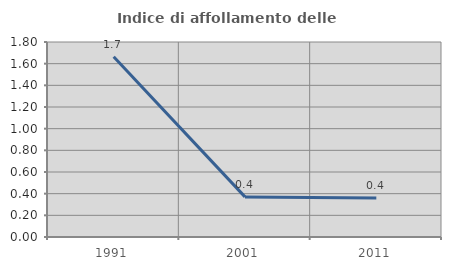
| Category | Indice di affollamento delle abitazioni  |
|---|---|
| 1991.0 | 1.663 |
| 2001.0 | 0.37 |
| 2011.0 | 0.359 |